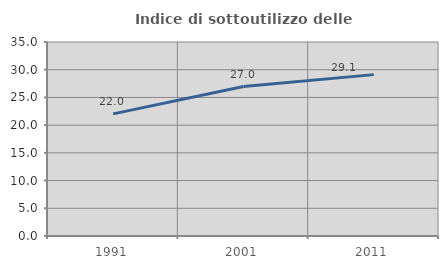
| Category | Indice di sottoutilizzo delle abitazioni  |
|---|---|
| 1991.0 | 22.034 |
| 2001.0 | 26.957 |
| 2011.0 | 29.114 |